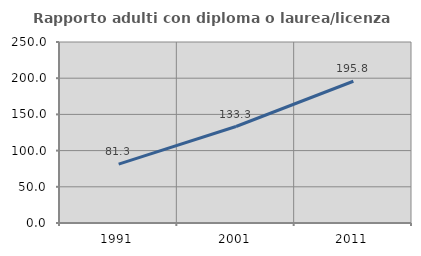
| Category | Rapporto adulti con diploma o laurea/licenza media  |
|---|---|
| 1991.0 | 81.303 |
| 2001.0 | 133.272 |
| 2011.0 | 195.788 |